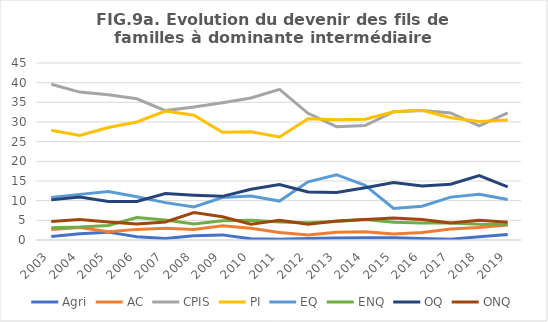
| Category | Agri | AC | CPIS | PI | EQ | ENQ | OQ | ONQ |
|---|---|---|---|---|---|---|---|---|
| 2003.0 | 0.9 | 2.7 | 39.6 | 27.9 | 10.8 | 3.1 | 10.2 | 4.7 |
| 2004.0 | 1.6 | 3.2 | 37.6 | 26.6 | 11.6 | 3.3 | 10.9 | 5.2 |
| 2005.0 | 2 | 2.1 | 36.9 | 28.6 | 12.3 | 3.7 | 9.8 | 4.6 |
| 2006.0 | 0.8 | 2.7 | 35.9 | 30 | 11 | 5.7 | 9.8 | 4.1 |
| 2007.0 | 0.4 | 3 | 32.9 | 32.8 | 9.5 | 5.1 | 11.8 | 4.6 |
| 2008.0 | 1.1 | 2.7 | 33.8 | 31.7 | 8.4 | 4.1 | 11.4 | 7 |
| 2009.0 | 1.3 | 3.6 | 34.9 | 27.4 | 10.8 | 4.9 | 11.1 | 5.9 |
| 2010.0 | 0.3 | 3 | 36.1 | 27.5 | 11.2 | 5 | 12.9 | 4 |
| 2011.0 | 0.2 | 1.9 | 38.3 | 26.2 | 9.9 | 4.6 | 14.1 | 5 |
| 2012.0 | 0.4 | 1.3 | 32.2 | 30.8 | 14.8 | 4.4 | 12.2 | 4 |
| 2013.0 | 0.5 | 2 | 28.8 | 30.6 | 16.6 | 4.7 | 12.1 | 4.8 |
| 2014.0 | 0.6 | 2.1 | 29.1 | 30.7 | 13.9 | 5.2 | 13.3 | 5.2 |
| 2015.0 | 0.6 | 1.5 | 32.6 | 32.6 | 8 | 4.5 | 14.6 | 5.6 |
| 2016.0 | 0.4 | 1.9 | 32.9 | 33 | 8.6 | 4.3 | 13.7 | 5.2 |
| 2017.0 | 0.2 | 2.8 | 32.3 | 31.1 | 10.9 | 4.3 | 14.2 | 4.3 |
| 2018.0 | 0.8 | 3.2 | 29 | 30.1 | 11.6 | 4 | 16.4 | 5 |
| 2019.0 | 1.4 | 3.8 | 32.3 | 30.5 | 10.3 | 3.9 | 13.5 | 4.5 |